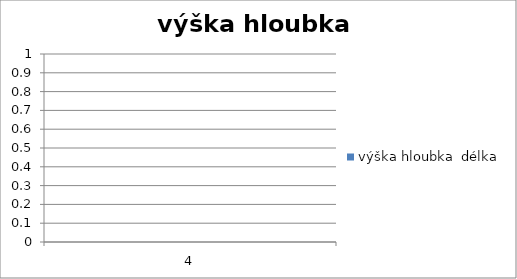
| Category | výška hloubka  délka |
|---|---|
| 4.0 | 0 |